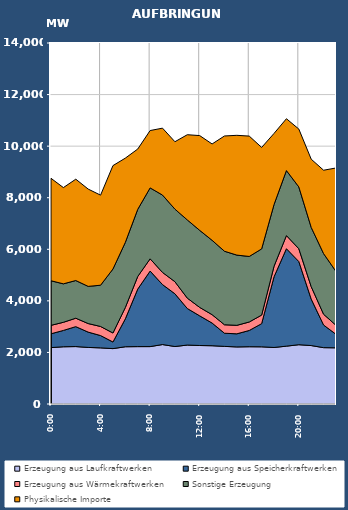
| Category | Erzeugung aus Laufkraftwerken | Erzeugung aus Speicherkraftwerken | Erzeugung aus Wärmekraftwerken | Sonstige Erzeugung | Physikalische Importe |
|---|---|---|---|---|---|
| 2007-01-17 | 2187.54 | 535.656 | 327.355 | 1729.118 | 3973.267 |
| 2007-01-17 01:00:00 | 2219.531 | 633.543 | 315.894 | 1491.379 | 3732.703 |
| 2007-01-17 02:00:00 | 2227.12 | 772.968 | 327.174 | 1461.3 | 3929.991 |
| 2007-01-17 03:00:00 | 2193.708 | 594.336 | 331.822 | 1441.569 | 3773.611 |
| 2007-01-17 04:00:00 | 2176.695 | 477.882 | 351.864 | 1600.113 | 3492.539 |
| 2007-01-17 05:00:00 | 2148.097 | 256 | 349.057 | 2482.124 | 4010.019 |
| 2007-01-17 06:00:00 | 2220.247 | 1083.63 | 440.555 | 2524.977 | 3266.207 |
| 2007-01-17 07:00:00 | 2225.638 | 2231.641 | 487.433 | 2604.43 | 2339.331 |
| 2007-01-17 08:00:00 | 2226.245 | 2929.343 | 475.371 | 2749.672 | 2224.271 |
| 2007-01-17 09:00:00 | 2305.491 | 2325.225 | 471.998 | 2999.568 | 2595.771 |
| 2007-01-17 10:00:00 | 2229.46 | 2045.906 | 468.02 | 2813.938 | 2613.667 |
| 2007-01-17 11:00:00 | 2286.236 | 1417.572 | 402.273 | 3033.143 | 3304.395 |
| 2007-01-17 12:00:00 | 2268.243 | 1151.114 | 327.115 | 2987.794 | 3675.384 |
| 2007-01-17 13:00:00 | 2259.866 | 880.638 | 324.191 | 2883.924 | 3736.14 |
| 2007-01-17 14:00:00 | 2234.199 | 510.665 | 328.361 | 2850.732 | 4470.09 |
| 2007-01-17 15:00:00 | 2213.032 | 508.494 | 329.915 | 2722.82 | 4645.73 |
| 2007-01-17 16:00:00 | 2221.429 | 630.257 | 329.007 | 2540.88 | 4667.823 |
| 2007-01-17 17:00:00 | 2217.588 | 898.287 | 332.533 | 2566.4 | 3935.459 |
| 2007-01-17 18:00:00 | 2191.778 | 2741.776 | 409.054 | 2393.499 | 2757.655 |
| 2007-01-17 19:00:00 | 2243.611 | 3779.19 | 508.342 | 2521.522 | 2010.815 |
| 2007-01-17 20:00:00 | 2299.053 | 3226.059 | 497.032 | 2396.43 | 2243.931 |
| 2007-01-17 21:00:00 | 2266.8 | 1802.356 | 482.353 | 2297.947 | 2644.995 |
| 2007-01-17 22:00:00 | 2185.09 | 877.999 | 417.435 | 2350.031 | 3235.403 |
| 2007-01-17 23:00:00 | 2178.958 | 524.417 | 348.78 | 2088.33 | 4013.287 |